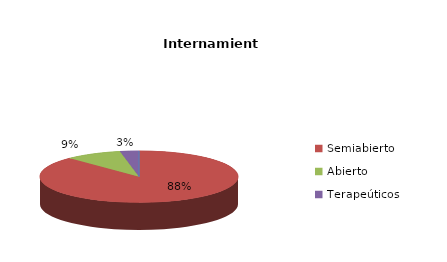
| Category | Series 0 |
|---|---|
| Cerrado | 0 |
| Semiabierto | 57 |
| Abierto | 6 |
| Terapeúticos | 2 |